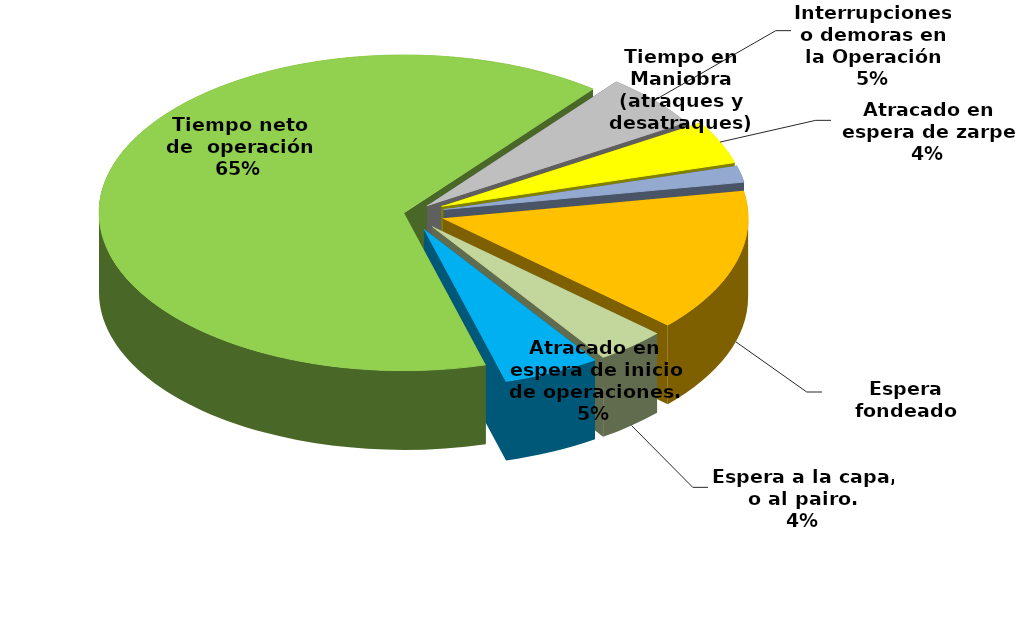
| Category | Series 0 |
|---|---|
| Espera fondeado | 19669.36 |
| Espera a la capa, o al pairo. | 5015.267 |
| Atracado en espera de inicio de operaciones. | 6923.299 |
| Tiempo neto de  operación | 87527.141 |
| Interrupciones o demoras en la Operación | 7392.41 |
| Atracado en espera de zarpe | 5930.401 |
| Tiempo en Maniobra (atraques y desatraques) | 2278.917 |